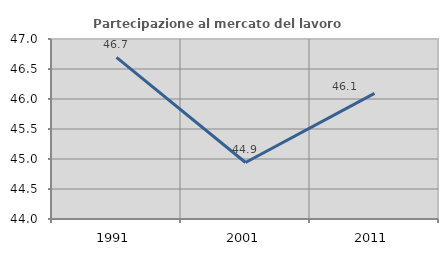
| Category | Partecipazione al mercato del lavoro  femminile |
|---|---|
| 1991.0 | 46.694 |
| 2001.0 | 44.942 |
| 2011.0 | 46.093 |